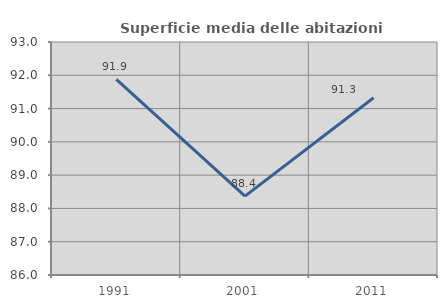
| Category | Superficie media delle abitazioni occupate |
|---|---|
| 1991.0 | 91.88 |
| 2001.0 | 88.369 |
| 2011.0 | 91.325 |